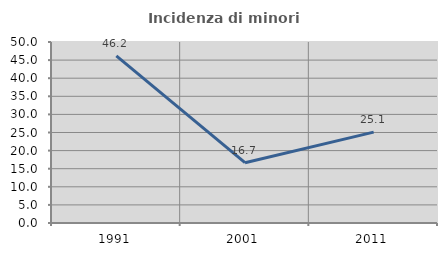
| Category | Incidenza di minori stranieri |
|---|---|
| 1991.0 | 46.154 |
| 2001.0 | 16.667 |
| 2011.0 | 25.1 |